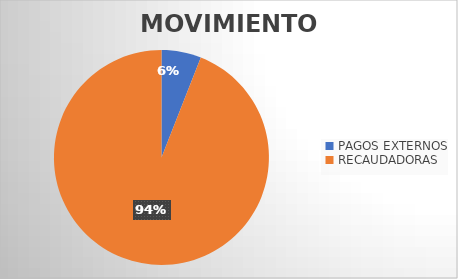
| Category | MOVIMIENTOS |
|---|---|
| PAGOS EXTERNOS | 2333 |
| RECAUDADORAS | 36804 |